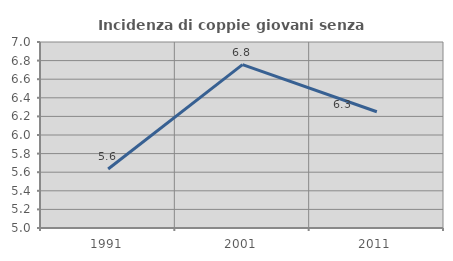
| Category | Incidenza di coppie giovani senza figli |
|---|---|
| 1991.0 | 5.634 |
| 2001.0 | 6.757 |
| 2011.0 | 6.25 |